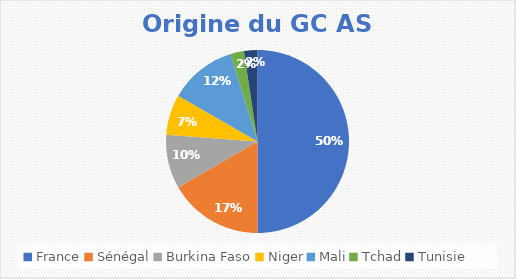
| Category | Series 0 |
|---|---|
| France | 21 |
| Sénégal | 7 |
| Burkina Faso | 4 |
| Niger | 3 |
| Mali | 5 |
| Tchad | 1 |
| Tunisie | 1 |